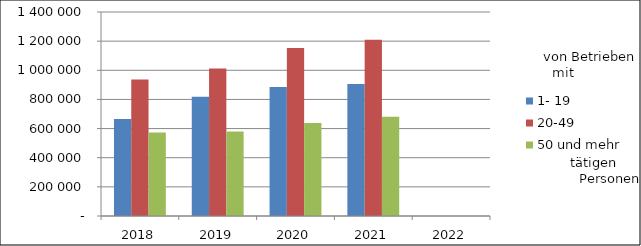
| Category | 1- 19 | 20-49 | 50 und mehr |
|---|---|---|---|
| 2018.0 | 664851.298 | 937490.312 | 572802.95 |
| 2019.0 | 818979.303 | 1012806.333 | 580363.324 |
| 2020.0 | 885090.354 | 1152770.647 | 637925.191 |
| 2021.0 | 905654.119 | 1210146.941 | 680929.509 |
| 2022.0 | 0 | 0 | 0 |